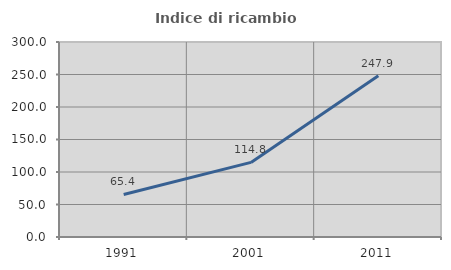
| Category | Indice di ricambio occupazionale  |
|---|---|
| 1991.0 | 65.438 |
| 2001.0 | 114.754 |
| 2011.0 | 247.932 |